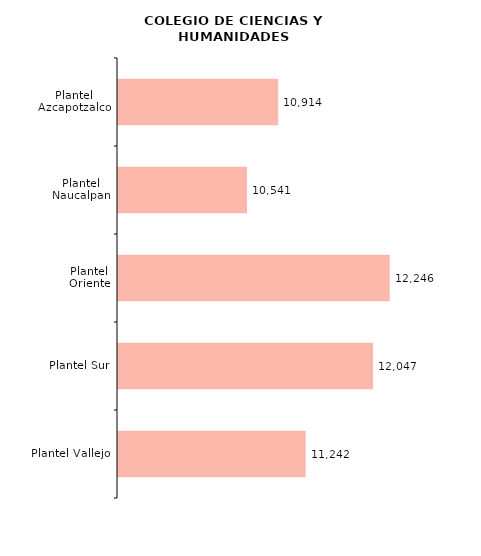
| Category | Series 0 |
|---|---|
| Plantel Vallejo | 11242 |
| Plantel Sur | 12047 |
| Plantel Oriente | 12246 |
| Plantel Naucalpan | 10541 |
| Plantel Azcapotzalco | 10914 |